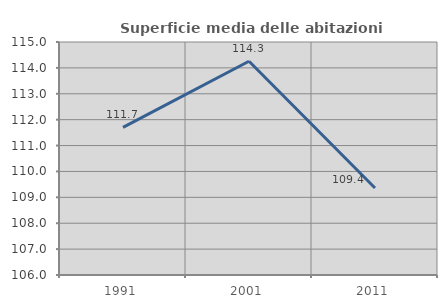
| Category | Superficie media delle abitazioni occupate |
|---|---|
| 1991.0 | 111.704 |
| 2001.0 | 114.255 |
| 2011.0 | 109.363 |